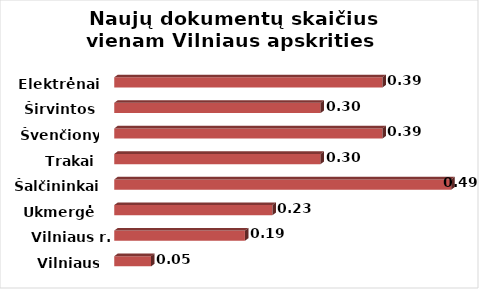
| Category | Series 0 |
|---|---|
| Vilniaus m. | 0.054 |
| Vilniaus r. | 0.19 |
| Ukmergė | 0.23 |
| Šalčininkai | 0.49 |
| Trakai | 0.3 |
| Švenčionys | 0.39 |
| Širvintos | 0.3 |
| Elektrėnai | 0.39 |